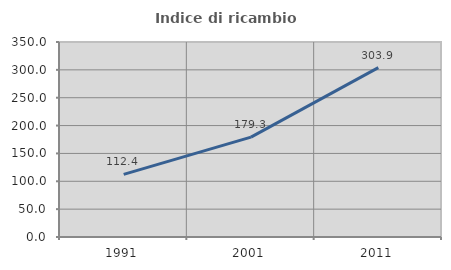
| Category | Indice di ricambio occupazionale  |
|---|---|
| 1991.0 | 112.426 |
| 2001.0 | 179.279 |
| 2011.0 | 303.947 |